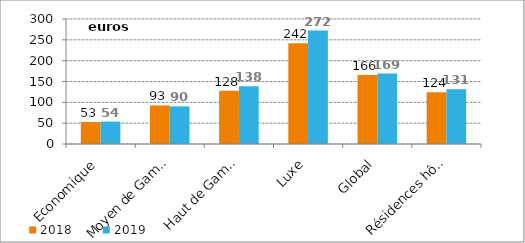
| Category | 2018 | 2019 |
|---|---|---|
| Economique | 52.613 | 53.795 |
| Moyen de Gamme | 92.545 | 90.295 |
| Haut de Gamme | 127.577 | 138.466 |
| Luxe | 241.783 | 272.128 |
| Global | 165.599 | 168.999 |
| Résidences hôtelières | 124.287 | 131.408 |